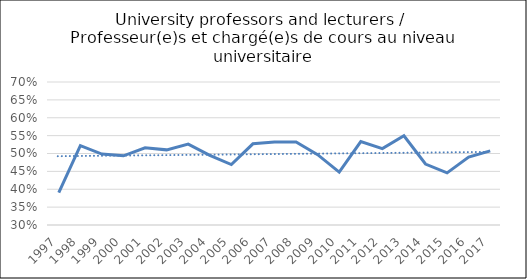
| Category | Series 0 |
|---|---|
| 1997.0 | 0.391 |
| 1998.0 | 0.522 |
| 1999.0 | 0.498 |
| 2000.0 | 0.494 |
| 2001.0 | 0.516 |
| 2002.0 | 0.51 |
| 2003.0 | 0.526 |
| 2004.0 | 0.495 |
| 2005.0 | 0.469 |
| 2006.0 | 0.527 |
| 2007.0 | 0.532 |
| 2008.0 | 0.532 |
| 2009.0 | 0.497 |
| 2010.0 | 0.448 |
| 2011.0 | 0.533 |
| 2012.0 | 0.514 |
| 2013.0 | 0.549 |
| 2014.0 | 0.471 |
| 2015.0 | 0.446 |
| 2016.0 | 0.49 |
| 2017.0 | 0.507 |